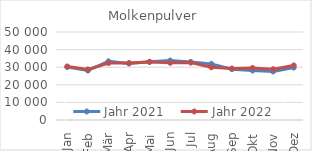
| Category | Jahr 2021 | Jahr 2022 |
|---|---|---|
| Jan | 30107.632 | 30420.21 |
| Feb | 28097.651 | 28741.791 |
| Mär | 33340.625 | 32355.762 |
| Apr | 32082.961 | 32375.318 |
| Mai | 33087.993 | 32980.09 |
| Jun | 33792.76 | 32509.616 |
| Jul | 32980.451 | 32614.776 |
| Aug | 31896.175 | 29928.048 |
| Sep | 28877.086 | 29251.161 |
| Okt | 28118.716 | 29580.829 |
| Nov | 27552.069 | 28856.292 |
| Dez | 29797.393 | 31019.884 |